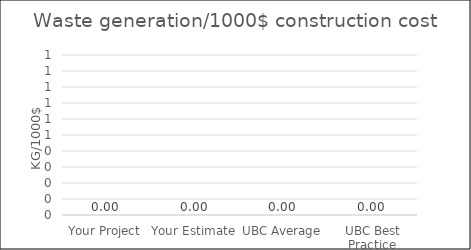
| Category | Waste generation/1000$ construction cost |
|---|---|
| Your Project | 0 |
| Your Estimate | 0 |
| UBC Average | 0 |
| UBC Best Practice | 0 |